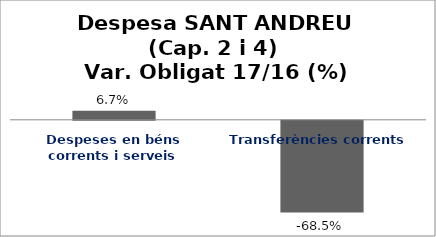
| Category | Series 0 |
|---|---|
| Despeses en béns corrents i serveis | 0.067 |
| Transferències corrents | -0.685 |